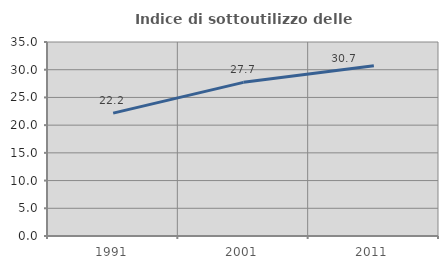
| Category | Indice di sottoutilizzo delle abitazioni  |
|---|---|
| 1991.0 | 22.17 |
| 2001.0 | 27.723 |
| 2011.0 | 30.722 |